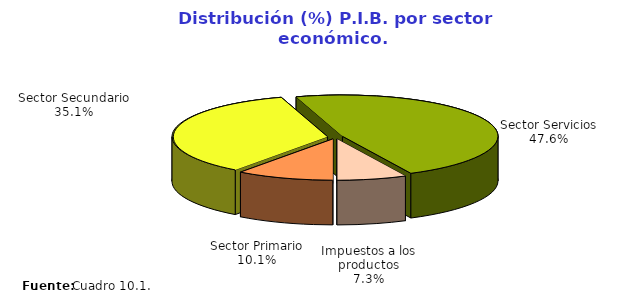
| Category | Series 0 |
|---|---|
| Sector Primario | 26711383.166 |
| Sector Secundario | 92627647.759 |
| Sector Servicios | 125608295.42 |
| Impuestos a los productos | 19155675.807 |